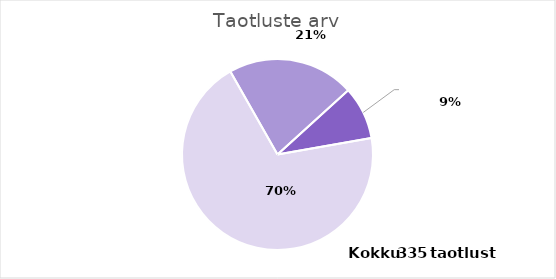
| Category | Taotluste arv |
|---|---|
| PRG | 233 |
| PSG | 72 |
| PUTJD | 30 |